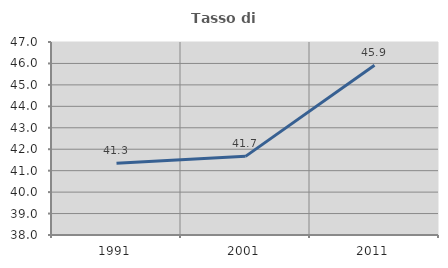
| Category | Tasso di occupazione   |
|---|---|
| 1991.0 | 41.346 |
| 2001.0 | 41.667 |
| 2011.0 | 45.918 |